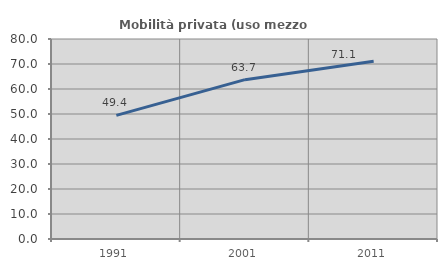
| Category | Mobilità privata (uso mezzo privato) |
|---|---|
| 1991.0 | 49.432 |
| 2001.0 | 63.736 |
| 2011.0 | 71.08 |